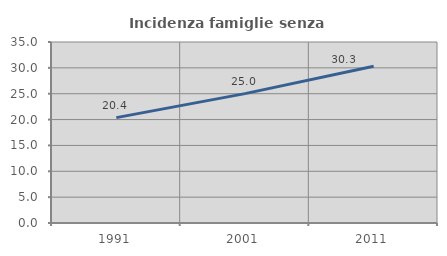
| Category | Incidenza famiglie senza nuclei |
|---|---|
| 1991.0 | 20.375 |
| 2001.0 | 25.017 |
| 2011.0 | 30.311 |